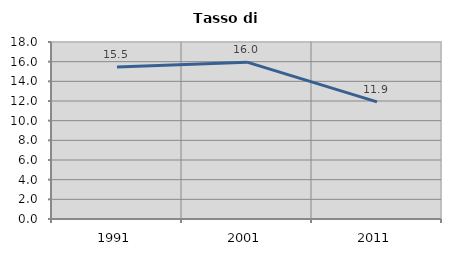
| Category | Tasso di disoccupazione   |
|---|---|
| 1991.0 | 15.47 |
| 2001.0 | 15.951 |
| 2011.0 | 11.905 |